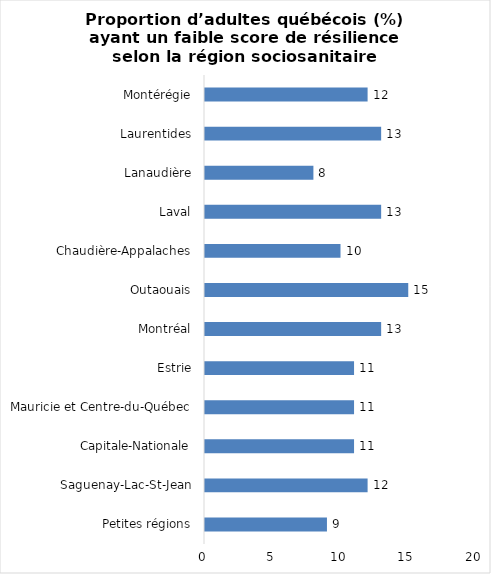
| Category | Series 0 |
|---|---|
| Petites régions | 9 |
| Saguenay-Lac-St-Jean | 12 |
| Capitale-Nationale | 11 |
| Mauricie et Centre-du-Québec | 11 |
| Estrie | 11 |
| Montréal | 13 |
| Outaouais | 15 |
| Chaudière-Appalaches | 10 |
| Laval | 13 |
| Lanaudière | 8 |
| Laurentides | 13 |
| Montérégie | 12 |